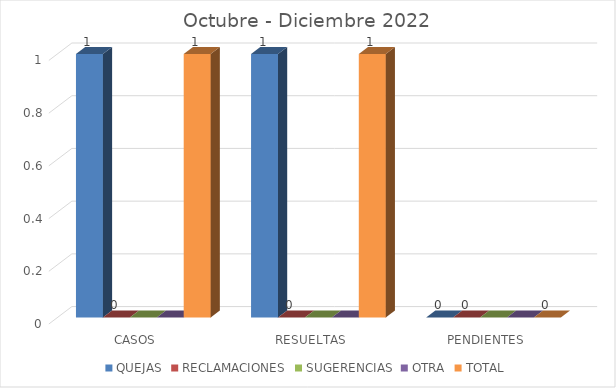
| Category | QUEJAS | RECLAMACIONES | SUGERENCIAS | OTRA | TOTAL |
|---|---|---|---|---|---|
| CASOS | 1 | 0 | 0 | 0 | 1 |
| RESUELTAS | 1 | 0 | 0 | 0 | 1 |
| PENDIENTES | 0 | 0 | 0 | 0 | 0 |